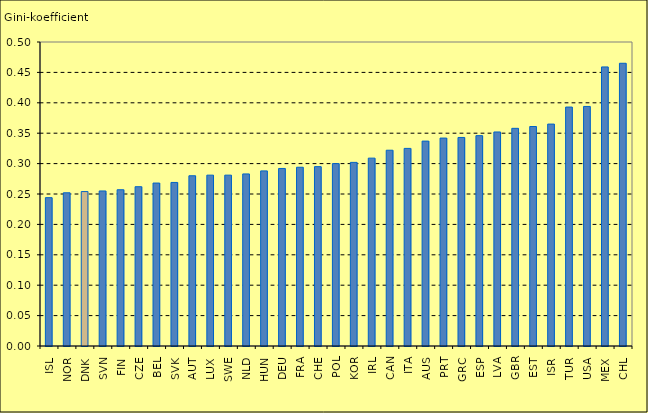
| Category | Series 0 |
|---|---|
| ISL | 0.244 |
| NOR | 0.252 |
| DNK | 0.254 |
| SVN | 0.255 |
| FIN | 0.257 |
| CZE | 0.262 |
| BEL | 0.268 |
| SVK | 0.269 |
| AUT | 0.28 |
| LUX | 0.281 |
| SWE | 0.281 |
| NLD | 0.283 |
| HUN | 0.288 |
| DEU | 0.292 |
| FRA | 0.294 |
| CHE | 0.295 |
| POL | 0.3 |
| KOR | 0.302 |
| IRL | 0.309 |
| CAN | 0.322 |
| ITA | 0.325 |
| AUS | 0.337 |
| PRT | 0.342 |
| GRC | 0.343 |
| ESP | 0.346 |
| LVA | 0.352 |
| GBR | 0.358 |
| EST | 0.361 |
| ISR | 0.365 |
| TUR | 0.393 |
| USA | 0.394 |
| MEX | 0.459 |
| CHL | 0.465 |